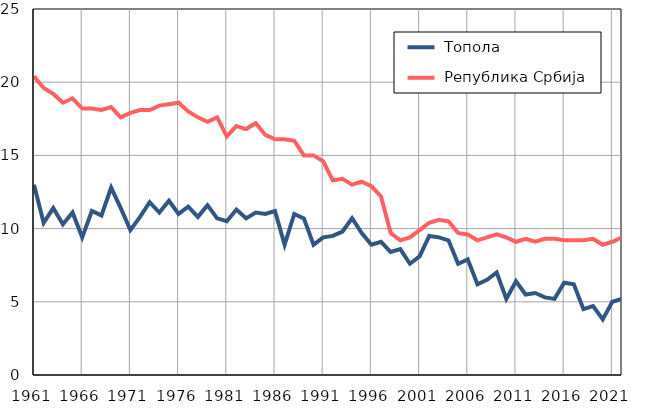
| Category |  Топола |  Република Србија |
|---|---|---|
| 1961.0 | 13 | 20.4 |
| 1962.0 | 10.4 | 19.6 |
| 1963.0 | 11.4 | 19.2 |
| 1964.0 | 10.3 | 18.6 |
| 1965.0 | 11.1 | 18.9 |
| 1966.0 | 9.4 | 18.2 |
| 1967.0 | 11.2 | 18.2 |
| 1968.0 | 10.9 | 18.1 |
| 1969.0 | 12.8 | 18.3 |
| 1970.0 | 11.4 | 17.6 |
| 1971.0 | 9.9 | 17.9 |
| 1972.0 | 10.8 | 18.1 |
| 1973.0 | 11.8 | 18.1 |
| 1974.0 | 11.1 | 18.4 |
| 1975.0 | 11.9 | 18.5 |
| 1976.0 | 11 | 18.6 |
| 1977.0 | 11.5 | 18 |
| 1978.0 | 10.8 | 17.6 |
| 1979.0 | 11.6 | 17.3 |
| 1980.0 | 10.7 | 17.6 |
| 1981.0 | 10.5 | 16.3 |
| 1982.0 | 11.3 | 17 |
| 1983.0 | 10.7 | 16.8 |
| 1984.0 | 11.1 | 17.2 |
| 1985.0 | 11 | 16.4 |
| 1986.0 | 11.2 | 16.1 |
| 1987.0 | 8.9 | 16.1 |
| 1988.0 | 11 | 16 |
| 1989.0 | 10.7 | 15 |
| 1990.0 | 8.9 | 15 |
| 1991.0 | 9.4 | 14.6 |
| 1992.0 | 9.5 | 13.3 |
| 1993.0 | 9.8 | 13.4 |
| 1994.0 | 10.7 | 13 |
| 1995.0 | 9.7 | 13.2 |
| 1996.0 | 8.9 | 12.9 |
| 1997.0 | 9.1 | 12.2 |
| 1998.0 | 8.4 | 9.7 |
| 1999.0 | 8.6 | 9.2 |
| 2000.0 | 7.6 | 9.4 |
| 2001.0 | 8.1 | 9.9 |
| 2002.0 | 9.5 | 10.4 |
| 2003.0 | 9.4 | 10.6 |
| 2004.0 | 9.2 | 10.5 |
| 2005.0 | 7.6 | 9.7 |
| 2006.0 | 7.9 | 9.6 |
| 2007.0 | 6.2 | 9.2 |
| 2008.0 | 6.5 | 9.4 |
| 2009.0 | 7 | 9.6 |
| 2010.0 | 5.2 | 9.4 |
| 2011.0 | 6.4 | 9.1 |
| 2012.0 | 5.5 | 9.3 |
| 2013.0 | 5.6 | 9.1 |
| 2014.0 | 5.3 | 9.3 |
| 2015.0 | 5.2 | 9.3 |
| 2016.0 | 6.3 | 9.2 |
| 2017.0 | 6.2 | 9.2 |
| 2018.0 | 4.5 | 9.2 |
| 2019.0 | 4.7 | 9.3 |
| 2020.0 | 3.8 | 8.9 |
| 2021.0 | 5 | 9.1 |
| 2022.0 | 5.2 | 9.4 |